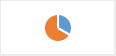
| Category | Section 2.F : Mesures mises en œuvre pour protéger l’environnement, la biodiversité et la santé |
|---|---|
| 0 | 0.333 |
| 1 | 0.667 |